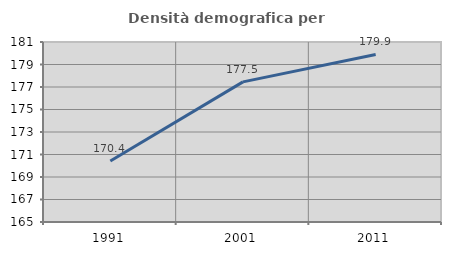
| Category | Densità demografica |
|---|---|
| 1991.0 | 170.429 |
| 2001.0 | 177.454 |
| 2011.0 | 179.891 |